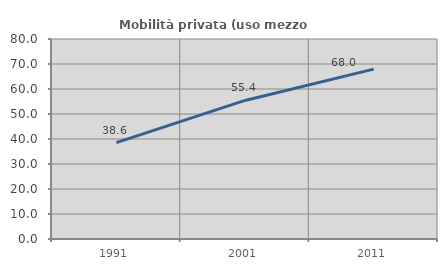
| Category | Mobilità privata (uso mezzo privato) |
|---|---|
| 1991.0 | 38.563 |
| 2001.0 | 55.427 |
| 2011.0 | 67.96 |